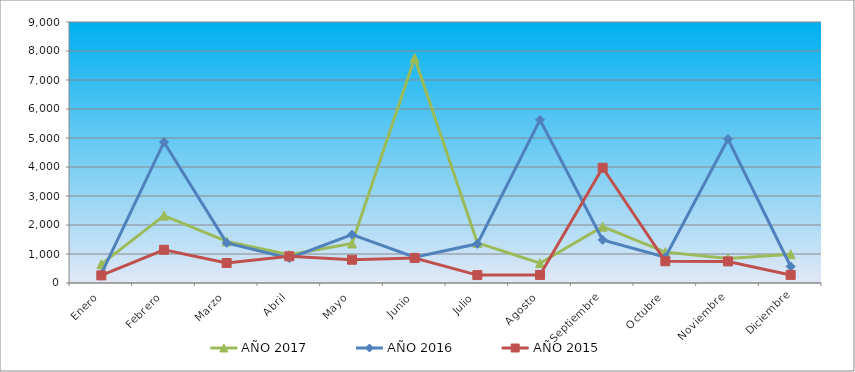
| Category | AÑO 2017 | AÑO 2016 | AÑO 2015 |
|---|---|---|---|
| Enero | 649.516 | 311.766 | 262.401 |
| Febrero | 2322.398 | 4858.227 | 1145.998 |
| Marzo | 1434.978 | 1383.803 | 690.812 |
| Abril | 978.051 | 858.723 | 921.082 |
| Mayo | 1363.229 | 1668.22 | 803.269 |
| Junio | 7758.905 | 891.541 | 862.176 |
| Julio | 1385.886 | 1350.985 | 273.112 |
| Agosto | 683.502 | 5626.898 | 278.467 |
| Septiembre | 1940.996 | 1487.724 | 3974.092 |
| Octubre | 1064.904 | 886.071 | 749.718 |
| Noviembre | 842.105 | 4965.185 | 744.363 |
| Diciembre | 989.379 | 568.836 | 278.467 |